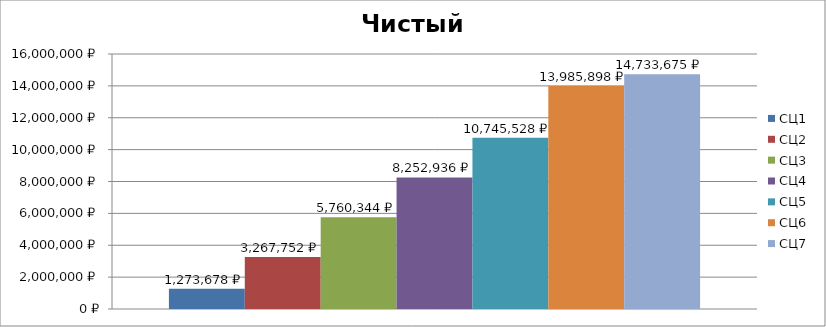
| Category | СЦ1 | СЦ2 | СЦ3 | СЦ4 | СЦ5 | СЦ6 | СЦ7 |
|---|---|---|---|---|---|---|---|
| 0 | 1273678.4 | 3267752 | 5760344 | 8252936 | 10745528 | 13985897.6 | 14733675.2 |